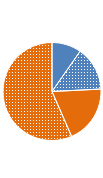
| Category | Series 1 | Series 0 |
|---|---|---|
| Full-Time | 0.097 | 0.097 |
| Part-Time | 0.145 | 0.145 |
| Full-Time | 0.192 | 0.192 |
| Part-Time | 0.566 | 0.566 |